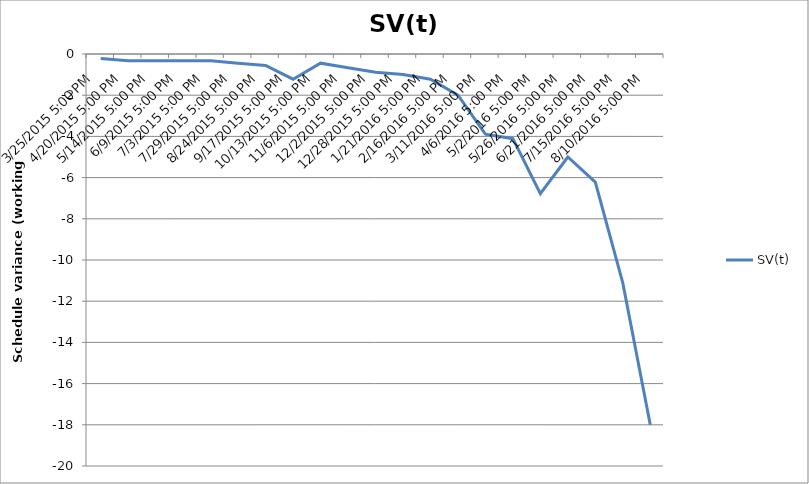
| Category | SV(t) |
|---|---|
| 3/25/2015 5:00 PM | -0.222 |
| 4/20/2015 5:00 PM | -0.333 |
| 5/14/2015 5:00 PM | -0.333 |
| 6/9/2015 5:00 PM | -0.333 |
| 7/3/2015 5:00 PM | -0.333 |
| 7/29/2015 5:00 PM | -0.444 |
| 8/24/2015 5:00 PM | -0.556 |
| 9/17/2015 5:00 PM | -1.222 |
| 10/13/2015 5:00 PM | -0.444 |
| 11/6/2015 5:00 PM | -0.667 |
| 12/2/2015 5:00 PM | -0.889 |
| 12/28/2015 5:00 PM | -1 |
| 1/21/2016 5:00 PM | -1.222 |
| 2/16/2016 5:00 PM | -2 |
| 3/11/2016 5:00 PM | -3.889 |
| 4/6/2016 5:00 PM | -4.111 |
| 5/2/2016 5:00 PM | -6.778 |
| 5/26/2016 5:00 PM | -5 |
| 6/21/2016 5:00 PM | -6.222 |
| 7/15/2016 5:00 PM | -11.111 |
| 8/10/2016 5:00 PM | -18 |